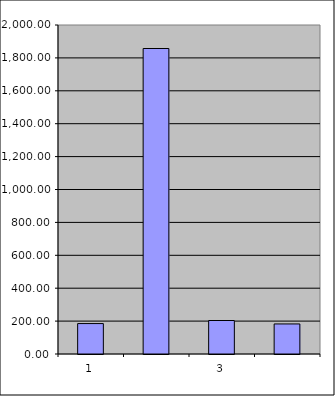
| Category | Series 0 |
|---|---|
| 0 | 185 |
| 1 | 1857.126 |
| 2 | 203.553 |
| 3 | 182.686 |